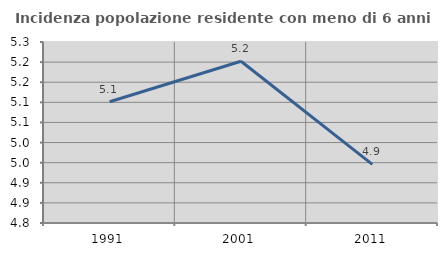
| Category | Incidenza popolazione residente con meno di 6 anni |
|---|---|
| 1991.0 | 5.102 |
| 2001.0 | 5.202 |
| 2011.0 | 4.946 |